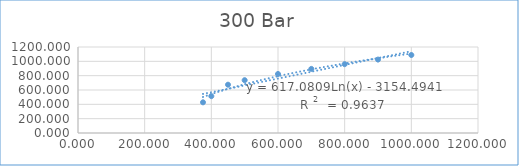
| Category | Series 0 |
|---|---|
| 375.0 | 428.046 |
| 400.0 | 514.286 |
| 450.0 | 673.913 |
| 500.0 | 736.909 |
| 600.0 | 823.387 |
| 700.0 | 894.386 |
| 800.0 | 960.344 |
| 900.0 | 1024.558 |
| 1000.0 | 1088.342 |